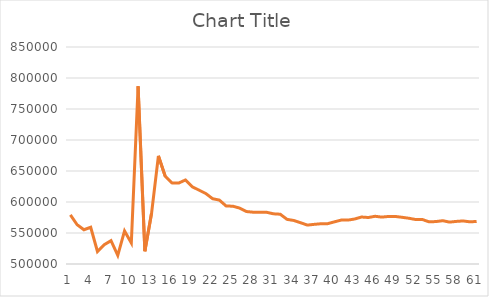
| Category | Series 0 |
|---|---|
| 0 | 579321.393 |
| 1 | 563257.42 |
| 2 | 555208.322 |
| 3 | 559168.006 |
| 4 | 520149.055 |
| 5 | 531047.184 |
| 6 | 537675.856 |
| 7 | 513962.94 |
| 8 | 553344.903 |
| 9 | 533856.027 |
| 10 | 786631.447 |
| 11 | 520624.199 |
| 12 | 582620.485 |
| 13 | 674466.032 |
| 14 | 641732.813 |
| 15 | 630833.951 |
| 16 | 630585.14 |
| 17 | 635518.252 |
| 18 | 624536.167 |
| 19 | 619156.266 |
| 20 | 613687.495 |
| 21 | 605344.664 |
| 22 | 603100.625 |
| 23 | 593595.177 |
| 24 | 593199.022 |
| 25 | 590168.021 |
| 26 | 584625.835 |
| 27 | 583527.282 |
| 28 | 583370.963 |
| 29 | 583366.252 |
| 30 | 580946.836 |
| 31 | 580280.383 |
| 32 | 571970.977 |
| 33 | 570213.168 |
| 34 | 566605.382 |
| 35 | 562759.896 |
| 36 | 563936.259 |
| 37 | 564903.944 |
| 38 | 565018.612 |
| 39 | 568002.009 |
| 40 | 570828.445 |
| 41 | 570831.458 |
| 42 | 572598.034 |
| 43 | 575782.774 |
| 44 | 574985.063 |
| 45 | 576964.88 |
| 46 | 575640.884 |
| 47 | 576703.894 |
| 48 | 576661.214 |
| 49 | 575331.248 |
| 50 | 573779.985 |
| 51 | 571744.764 |
| 52 | 571693.363 |
| 53 | 567969.777 |
| 54 | 568466.572 |
| 55 | 569830.641 |
| 56 | 567581.908 |
| 57 | 568700.932 |
| 58 | 569455.741 |
| 59 | 568027.956 |
| 60 | 568609.333 |